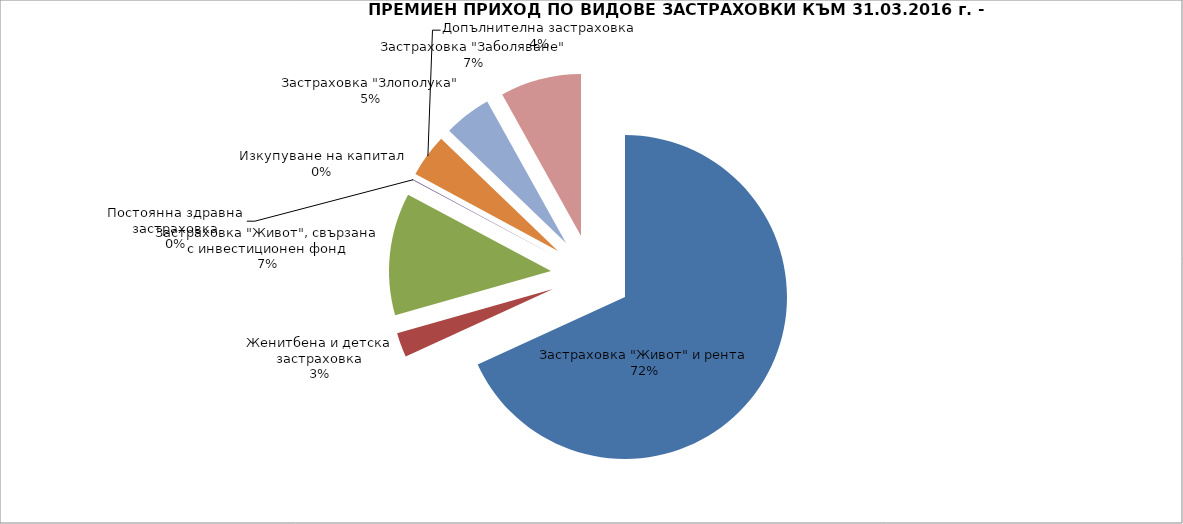
| Category | ПРЕМИЕН ПРИХОД ПО ВИДОВЕ ЗАСТРАХОВКИ КЪМ 31.03.2016 г. - ЖИВОТОЗАСТРАХОВАНЕ1  |
|---|---|
| Застраховка "Живот" и рента | 77511234.002 |
| Женитбена и детска застраховка | 2765874.19 |
| Застраховка "Живот", свързана с инвестиционен фонд | 13874430.094 |
| Постоянна здравна застраховка | 79906.47 |
| Изкупуване на капитал | 0 |
| Допълнителна застраховка | 4892659.236 |
| Застраховка "Злополука" | 5385167.67 |
| Застраховка "Заболяване" | 9192085.62 |